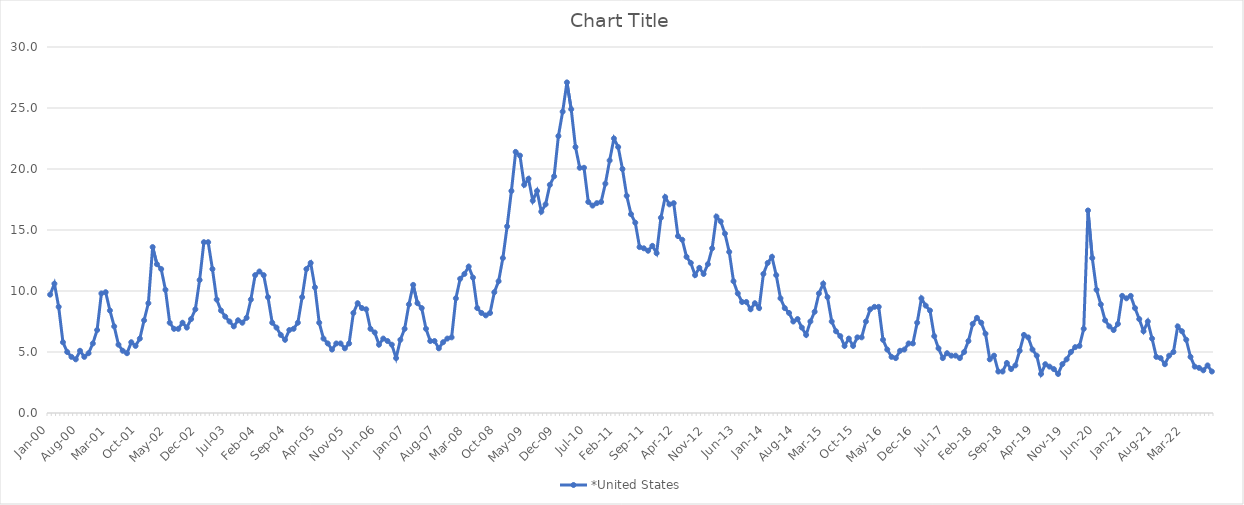
| Category | *United States | Alaska | Alabama | Arkansas | Arizona | California | Colorado | Connecticut | Delaware | Florida | Georgia | Hawaii | Iowa | Idaho | Illinois | Indiana | Kansas | Kentucky | Louisiana | Massachusetts | Maryland | Maine | Michigan | Minnesota | Missouri | Mississippi | Montana | North Carolina | North Dakota | Nebraska | New Hampshire | New Jersey | New Mexico | Nevada | New York | Ohio | Oklahoma | Oregon | Pennsylvania | Rhode Island | South Carolina | South Dakota | Tennessee | Texas | Utah | Virginia | Vermont | Washington | Wisconsin | West Virginia | Wyoming |
|---|---|---|---|---|---|---|---|---|---|---|---|---|---|---|---|---|---|---|---|---|---|---|---|---|---|---|---|---|---|---|---|---|---|---|---|---|---|---|---|---|---|---|---|---|---|---|---|---|---|---|---|
| Jan-00 | 9.7 |  |  |  |  |  |  |  |  |  |  |  |  |  |  |  |  |  |  |  |  |  |  |  |  |  |  |  |  |  |  |  |  |  |  |  |  |  |  |  |  |  |  |  |  |  |  |  |  |  |  |
| Feb-00 | 10.6 |  |  |  |  |  |  |  |  |  |  |  |  |  |  |  |  |  |  |  |  |  |  |  |  |  |  |  |  |  |  |  |  |  |  |  |  |  |  |  |  |  |  |  |  |  |  |  |  |  |  |
| Mar-00 | 8.7 |  |  |  |  |  |  |  |  |  |  |  |  |  |  |  |  |  |  |  |  |  |  |  |  |  |  |  |  |  |  |  |  |  |  |  |  |  |  |  |  |  |  |  |  |  |  |  |  |  |  |
| Apr-00 | 5.8 |  |  |  |  |  |  |  |  |  |  |  |  |  |  |  |  |  |  |  |  |  |  |  |  |  |  |  |  |  |  |  |  |  |  |  |  |  |  |  |  |  |  |  |  |  |  |  |  |  |  |
| May-00 | 5 |  |  |  |  |  |  |  |  |  |  |  |  |  |  |  |  |  |  |  |  |  |  |  |  |  |  |  |  |  |  |  |  |  |  |  |  |  |  |  |  |  |  |  |  |  |  |  |  |  |  |
| Jun-00 | 4.6 |  |  |  |  |  |  |  |  |  |  |  |  |  |  |  |  |  |  |  |  |  |  |  |  |  |  |  |  |  |  |  |  |  |  |  |  |  |  |  |  |  |  |  |  |  |  |  |  |  |  |
| Jul-00 | 4.4 |  |  |  |  |  |  |  |  |  |  |  |  |  |  |  |  |  |  |  |  |  |  |  |  |  |  |  |  |  |  |  |  |  |  |  |  |  |  |  |  |  |  |  |  |  |  |  |  |  |  |
| Aug-00 | 5.1 |  |  |  |  |  |  |  |  |  |  |  |  |  |  |  |  |  |  |  |  |  |  |  |  |  |  |  |  |  |  |  |  |  |  |  |  |  |  |  |  |  |  |  |  |  |  |  |  |  |  |
| Sep-00 | 4.6 |  |  |  |  |  |  |  |  |  |  |  |  |  |  |  |  |  |  |  |  |  |  |  |  |  |  |  |  |  |  |  |  |  |  |  |  |  |  |  |  |  |  |  |  |  |  |  |  |  |  |
| Oct-00 | 4.9 |  |  |  |  |  |  |  |  |  |  |  |  |  |  |  |  |  |  |  |  |  |  |  |  |  |  |  |  |  |  |  |  |  |  |  |  |  |  |  |  |  |  |  |  |  |  |  |  |  |  |
| Nov-00 | 5.7 |  |  |  |  |  |  |  |  |  |  |  |  |  |  |  |  |  |  |  |  |  |  |  |  |  |  |  |  |  |  |  |  |  |  |  |  |  |  |  |  |  |  |  |  |  |  |  |  |  |  |
| Dec-00 | 6.8 |  |  |  |  |  |  |  |  |  |  |  |  |  |  |  |  |  |  |  |  |  |  |  |  |  |  |  |  |  |  |  |  |  |  |  |  |  |  |  |  |  |  |  |  |  |  |  |  |  |  |
| Jan-01 | 9.8 |  |  |  |  |  |  |  |  |  |  |  |  |  |  |  |  |  |  |  |  |  |  |  |  |  |  |  |  |  |  |  |  |  |  |  |  |  |  |  |  |  |  |  |  |  |  |  |  |  |  |
| Feb-01 | 9.9 |  |  |  |  |  |  |  |  |  |  |  |  |  |  |  |  |  |  |  |  |  |  |  |  |  |  |  |  |  |  |  |  |  |  |  |  |  |  |  |  |  |  |  |  |  |  |  |  |  |  |
| Mar-01 | 8.4 |  |  |  |  |  |  |  |  |  |  |  |  |  |  |  |  |  |  |  |  |  |  |  |  |  |  |  |  |  |  |  |  |  |  |  |  |  |  |  |  |  |  |  |  |  |  |  |  |  |  |
| Apr-01 | 7.1 |  |  |  |  |  |  |  |  |  |  |  |  |  |  |  |  |  |  |  |  |  |  |  |  |  |  |  |  |  |  |  |  |  |  |  |  |  |  |  |  |  |  |  |  |  |  |  |  |  |  |
| May-01 | 5.6 |  |  |  |  |  |  |  |  |  |  |  |  |  |  |  |  |  |  |  |  |  |  |  |  |  |  |  |  |  |  |  |  |  |  |  |  |  |  |  |  |  |  |  |  |  |  |  |  |  |  |
| Jun-01 | 5.1 |  |  |  |  |  |  |  |  |  |  |  |  |  |  |  |  |  |  |  |  |  |  |  |  |  |  |  |  |  |  |  |  |  |  |  |  |  |  |  |  |  |  |  |  |  |  |  |  |  |  |
| Jul-01 | 4.9 |  |  |  |  |  |  |  |  |  |  |  |  |  |  |  |  |  |  |  |  |  |  |  |  |  |  |  |  |  |  |  |  |  |  |  |  |  |  |  |  |  |  |  |  |  |  |  |  |  |  |
| Aug-01 | 5.8 |  |  |  |  |  |  |  |  |  |  |  |  |  |  |  |  |  |  |  |  |  |  |  |  |  |  |  |  |  |  |  |  |  |  |  |  |  |  |  |  |  |  |  |  |  |  |  |  |  |  |
| Sep-01 | 5.5 |  |  |  |  |  |  |  |  |  |  |  |  |  |  |  |  |  |  |  |  |  |  |  |  |  |  |  |  |  |  |  |  |  |  |  |  |  |  |  |  |  |  |  |  |  |  |  |  |  |  |
| Oct-01 | 6.1 |  |  |  |  |  |  |  |  |  |  |  |  |  |  |  |  |  |  |  |  |  |  |  |  |  |  |  |  |  |  |  |  |  |  |  |  |  |  |  |  |  |  |  |  |  |  |  |  |  |  |
| Nov-01 | 7.6 |  |  |  |  |  |  |  |  |  |  |  |  |  |  |  |  |  |  |  |  |  |  |  |  |  |  |  |  |  |  |  |  |  |  |  |  |  |  |  |  |  |  |  |  |  |  |  |  |  |  |
| Dec-01 | 9 |  |  |  |  |  |  |  |  |  |  |  |  |  |  |  |  |  |  |  |  |  |  |  |  |  |  |  |  |  |  |  |  |  |  |  |  |  |  |  |  |  |  |  |  |  |  |  |  |  |  |
| Jan-02 | 13.6 |  |  |  |  |  |  |  |  |  |  |  |  |  |  |  |  |  |  |  |  |  |  |  |  |  |  |  |  |  |  |  |  |  |  |  |  |  |  |  |  |  |  |  |  |  |  |  |  |  |  |
| Feb-02 | 12.2 |  |  |  |  |  |  |  |  |  |  |  |  |  |  |  |  |  |  |  |  |  |  |  |  |  |  |  |  |  |  |  |  |  |  |  |  |  |  |  |  |  |  |  |  |  |  |  |  |  |  |
| Mar-02 | 11.8 |  |  |  |  |  |  |  |  |  |  |  |  |  |  |  |  |  |  |  |  |  |  |  |  |  |  |  |  |  |  |  |  |  |  |  |  |  |  |  |  |  |  |  |  |  |  |  |  |  |  |
| Apr-02 | 10.1 |  |  |  |  |  |  |  |  |  |  |  |  |  |  |  |  |  |  |  |  |  |  |  |  |  |  |  |  |  |  |  |  |  |  |  |  |  |  |  |  |  |  |  |  |  |  |  |  |  |  |
| May-02 | 7.4 |  |  |  |  |  |  |  |  |  |  |  |  |  |  |  |  |  |  |  |  |  |  |  |  |  |  |  |  |  |  |  |  |  |  |  |  |  |  |  |  |  |  |  |  |  |  |  |  |  |  |
| Jun-02 | 6.9 |  |  |  |  |  |  |  |  |  |  |  |  |  |  |  |  |  |  |  |  |  |  |  |  |  |  |  |  |  |  |  |  |  |  |  |  |  |  |  |  |  |  |  |  |  |  |  |  |  |  |
| Jul-02 | 6.9 |  |  |  |  |  |  |  |  |  |  |  |  |  |  |  |  |  |  |  |  |  |  |  |  |  |  |  |  |  |  |  |  |  |  |  |  |  |  |  |  |  |  |  |  |  |  |  |  |  |  |
| Aug-02 | 7.4 |  |  |  |  |  |  |  |  |  |  |  |  |  |  |  |  |  |  |  |  |  |  |  |  |  |  |  |  |  |  |  |  |  |  |  |  |  |  |  |  |  |  |  |  |  |  |  |  |  |  |
| Sep-02 | 7 |  |  |  |  |  |  |  |  |  |  |  |  |  |  |  |  |  |  |  |  |  |  |  |  |  |  |  |  |  |  |  |  |  |  |  |  |  |  |  |  |  |  |  |  |  |  |  |  |  |  |
| Oct-02 | 7.7 |  |  |  |  |  |  |  |  |  |  |  |  |  |  |  |  |  |  |  |  |  |  |  |  |  |  |  |  |  |  |  |  |  |  |  |  |  |  |  |  |  |  |  |  |  |  |  |  |  |  |
| Nov-02 | 8.5 |  |  |  |  |  |  |  |  |  |  |  |  |  |  |  |  |  |  |  |  |  |  |  |  |  |  |  |  |  |  |  |  |  |  |  |  |  |  |  |  |  |  |  |  |  |  |  |  |  |  |
| Dec-02 | 10.9 |  |  |  |  |  |  |  |  |  |  |  |  |  |  |  |  |  |  |  |  |  |  |  |  |  |  |  |  |  |  |  |  |  |  |  |  |  |  |  |  |  |  |  |  |  |  |  |  |  |  |
| Jan-03 | 14 |  |  |  |  |  |  |  |  |  |  |  |  |  |  |  |  |  |  |  |  |  |  |  |  |  |  |  |  |  |  |  |  |  |  |  |  |  |  |  |  |  |  |  |  |  |  |  |  |  |  |
| Feb-03 | 14 |  |  |  |  |  |  |  |  |  |  |  |  |  |  |  |  |  |  |  |  |  |  |  |  |  |  |  |  |  |  |  |  |  |  |  |  |  |  |  |  |  |  |  |  |  |  |  |  |  |  |
| Mar-03 | 11.8 |  |  |  |  |  |  |  |  |  |  |  |  |  |  |  |  |  |  |  |  |  |  |  |  |  |  |  |  |  |  |  |  |  |  |  |  |  |  |  |  |  |  |  |  |  |  |  |  |  |  |
| Apr-03 | 9.3 |  |  |  |  |  |  |  |  |  |  |  |  |  |  |  |  |  |  |  |  |  |  |  |  |  |  |  |  |  |  |  |  |  |  |  |  |  |  |  |  |  |  |  |  |  |  |  |  |  |  |
| May-03 | 8.4 |  |  |  |  |  |  |  |  |  |  |  |  |  |  |  |  |  |  |  |  |  |  |  |  |  |  |  |  |  |  |  |  |  |  |  |  |  |  |  |  |  |  |  |  |  |  |  |  |  |  |
| Jun-03 | 7.9 |  |  |  |  |  |  |  |  |  |  |  |  |  |  |  |  |  |  |  |  |  |  |  |  |  |  |  |  |  |  |  |  |  |  |  |  |  |  |  |  |  |  |  |  |  |  |  |  |  |  |
| Jul-03 | 7.5 |  |  |  |  |  |  |  |  |  |  |  |  |  |  |  |  |  |  |  |  |  |  |  |  |  |  |  |  |  |  |  |  |  |  |  |  |  |  |  |  |  |  |  |  |  |  |  |  |  |  |
| Aug-03 | 7.1 |  |  |  |  |  |  |  |  |  |  |  |  |  |  |  |  |  |  |  |  |  |  |  |  |  |  |  |  |  |  |  |  |  |  |  |  |  |  |  |  |  |  |  |  |  |  |  |  |  |  |
| Sep-03 | 7.6 |  |  |  |  |  |  |  |  |  |  |  |  |  |  |  |  |  |  |  |  |  |  |  |  |  |  |  |  |  |  |  |  |  |  |  |  |  |  |  |  |  |  |  |  |  |  |  |  |  |  |
| Oct-03 | 7.4 |  |  |  |  |  |  |  |  |  |  |  |  |  |  |  |  |  |  |  |  |  |  |  |  |  |  |  |  |  |  |  |  |  |  |  |  |  |  |  |  |  |  |  |  |  |  |  |  |  |  |
| Nov-03 | 7.8 |  |  |  |  |  |  |  |  |  |  |  |  |  |  |  |  |  |  |  |  |  |  |  |  |  |  |  |  |  |  |  |  |  |  |  |  |  |  |  |  |  |  |  |  |  |  |  |  |  |  |
| Dec-03 | 9.3 |  |  |  |  |  |  |  |  |  |  |  |  |  |  |  |  |  |  |  |  |  |  |  |  |  |  |  |  |  |  |  |  |  |  |  |  |  |  |  |  |  |  |  |  |  |  |  |  |  |  |
| Jan-04 | 11.3 |  |  |  |  |  |  |  |  |  |  |  |  |  |  |  |  |  |  |  |  |  |  |  |  |  |  |  |  |  |  |  |  |  |  |  |  |  |  |  |  |  |  |  |  |  |  |  |  |  |  |
| Feb-04 | 11.6 |  |  |  |  |  |  |  |  |  |  |  |  |  |  |  |  |  |  |  |  |  |  |  |  |  |  |  |  |  |  |  |  |  |  |  |  |  |  |  |  |  |  |  |  |  |  |  |  |  |  |
| Mar-04 | 11.3 |  |  |  |  |  |  |  |  |  |  |  |  |  |  |  |  |  |  |  |  |  |  |  |  |  |  |  |  |  |  |  |  |  |  |  |  |  |  |  |  |  |  |  |  |  |  |  |  |  |  |
| Apr-04 | 9.5 |  |  |  |  |  |  |  |  |  |  |  |  |  |  |  |  |  |  |  |  |  |  |  |  |  |  |  |  |  |  |  |  |  |  |  |  |  |  |  |  |  |  |  |  |  |  |  |  |  |  |
| May-04 | 7.4 |  |  |  |  |  |  |  |  |  |  |  |  |  |  |  |  |  |  |  |  |  |  |  |  |  |  |  |  |  |  |  |  |  |  |  |  |  |  |  |  |  |  |  |  |  |  |  |  |  |  |
| Jun-04 | 7 |  |  |  |  |  |  |  |  |  |  |  |  |  |  |  |  |  |  |  |  |  |  |  |  |  |  |  |  |  |  |  |  |  |  |  |  |  |  |  |  |  |  |  |  |  |  |  |  |  |  |
| Jul-04 | 6.4 |  |  |  |  |  |  |  |  |  |  |  |  |  |  |  |  |  |  |  |  |  |  |  |  |  |  |  |  |  |  |  |  |  |  |  |  |  |  |  |  |  |  |  |  |  |  |  |  |  |  |
| Aug-04 | 6 |  |  |  |  |  |  |  |  |  |  |  |  |  |  |  |  |  |  |  |  |  |  |  |  |  |  |  |  |  |  |  |  |  |  |  |  |  |  |  |  |  |  |  |  |  |  |  |  |  |  |
| Sep-04 | 6.8 |  |  |  |  |  |  |  |  |  |  |  |  |  |  |  |  |  |  |  |  |  |  |  |  |  |  |  |  |  |  |  |  |  |  |  |  |  |  |  |  |  |  |  |  |  |  |  |  |  |  |
| Oct-04 | 6.9 |  |  |  |  |  |  |  |  |  |  |  |  |  |  |  |  |  |  |  |  |  |  |  |  |  |  |  |  |  |  |  |  |  |  |  |  |  |  |  |  |  |  |  |  |  |  |  |  |  |  |
| Nov-04 | 7.4 |  |  |  |  |  |  |  |  |  |  |  |  |  |  |  |  |  |  |  |  |  |  |  |  |  |  |  |  |  |  |  |  |  |  |  |  |  |  |  |  |  |  |  |  |  |  |  |  |  |  |
| Dec-04 | 9.5 |  |  |  |  |  |  |  |  |  |  |  |  |  |  |  |  |  |  |  |  |  |  |  |  |  |  |  |  |  |  |  |  |  |  |  |  |  |  |  |  |  |  |  |  |  |  |  |  |  |  |
| Jan-05 | 11.8 |  |  |  |  |  |  |  |  |  |  |  |  |  |  |  |  |  |  |  |  |  |  |  |  |  |  |  |  |  |  |  |  |  |  |  |  |  |  |  |  |  |  |  |  |  |  |  |  |  |  |
| Feb-05 | 12.3 |  |  |  |  |  |  |  |  |  |  |  |  |  |  |  |  |  |  |  |  |  |  |  |  |  |  |  |  |  |  |  |  |  |  |  |  |  |  |  |  |  |  |  |  |  |  |  |  |  |  |
| Mar-05 | 10.3 |  |  |  |  |  |  |  |  |  |  |  |  |  |  |  |  |  |  |  |  |  |  |  |  |  |  |  |  |  |  |  |  |  |  |  |  |  |  |  |  |  |  |  |  |  |  |  |  |  |  |
| Apr-05 | 7.4 |  |  |  |  |  |  |  |  |  |  |  |  |  |  |  |  |  |  |  |  |  |  |  |  |  |  |  |  |  |  |  |  |  |  |  |  |  |  |  |  |  |  |  |  |  |  |  |  |  |  |
| May-05 | 6.1 |  |  |  |  |  |  |  |  |  |  |  |  |  |  |  |  |  |  |  |  |  |  |  |  |  |  |  |  |  |  |  |  |  |  |  |  |  |  |  |  |  |  |  |  |  |  |  |  |  |  |
| Jun-05 | 5.7 |  |  |  |  |  |  |  |  |  |  |  |  |  |  |  |  |  |  |  |  |  |  |  |  |  |  |  |  |  |  |  |  |  |  |  |  |  |  |  |  |  |  |  |  |  |  |  |  |  |  |
| Jul-05 | 5.2 |  |  |  |  |  |  |  |  |  |  |  |  |  |  |  |  |  |  |  |  |  |  |  |  |  |  |  |  |  |  |  |  |  |  |  |  |  |  |  |  |  |  |  |  |  |  |  |  |  |  |
| Aug-05 | 5.7 |  |  |  |  |  |  |  |  |  |  |  |  |  |  |  |  |  |  |  |  |  |  |  |  |  |  |  |  |  |  |  |  |  |  |  |  |  |  |  |  |  |  |  |  |  |  |  |  |  |  |
| Sep-05 | 5.7 |  |  |  |  |  |  |  |  |  |  |  |  |  |  |  |  |  |  |  |  |  |  |  |  |  |  |  |  |  |  |  |  |  |  |  |  |  |  |  |  |  |  |  |  |  |  |  |  |  |  |
| Oct-05 | 5.3 |  |  |  |  |  |  |  |  |  |  |  |  |  |  |  |  |  |  |  |  |  |  |  |  |  |  |  |  |  |  |  |  |  |  |  |  |  |  |  |  |  |  |  |  |  |  |  |  |  |  |
| Nov-05 | 5.7 |  |  |  |  |  |  |  |  |  |  |  |  |  |  |  |  |  |  |  |  |  |  |  |  |  |  |  |  |  |  |  |  |  |  |  |  |  |  |  |  |  |  |  |  |  |  |  |  |  |  |
| Dec-05 | 8.2 |  |  |  |  |  |  |  |  |  |  |  |  |  |  |  |  |  |  |  |  |  |  |  |  |  |  |  |  |  |  |  |  |  |  |  |  |  |  |  |  |  |  |  |  |  |  |  |  |  |  |
| Jan-06 | 9 |  |  |  |  |  |  |  |  |  |  |  |  |  |  |  |  |  |  |  |  |  |  |  |  |  |  |  |  |  |  |  |  |  |  |  |  |  |  |  |  |  |  |  |  |  |  |  |  |  |  |
| Feb-06 | 8.6 |  |  |  |  |  |  |  |  |  |  |  |  |  |  |  |  |  |  |  |  |  |  |  |  |  |  |  |  |  |  |  |  |  |  |  |  |  |  |  |  |  |  |  |  |  |  |  |  |  |  |
| Mar-06 | 8.5 |  |  |  |  |  |  |  |  |  |  |  |  |  |  |  |  |  |  |  |  |  |  |  |  |  |  |  |  |  |  |  |  |  |  |  |  |  |  |  |  |  |  |  |  |  |  |  |  |  |  |
| Apr-06 | 6.9 |  |  |  |  |  |  |  |  |  |  |  |  |  |  |  |  |  |  |  |  |  |  |  |  |  |  |  |  |  |  |  |  |  |  |  |  |  |  |  |  |  |  |  |  |  |  |  |  |  |  |
| May-06 | 6.6 |  |  |  |  |  |  |  |  |  |  |  |  |  |  |  |  |  |  |  |  |  |  |  |  |  |  |  |  |  |  |  |  |  |  |  |  |  |  |  |  |  |  |  |  |  |  |  |  |  |  |
| Jun-06 | 5.6 |  |  |  |  |  |  |  |  |  |  |  |  |  |  |  |  |  |  |  |  |  |  |  |  |  |  |  |  |  |  |  |  |  |  |  |  |  |  |  |  |  |  |  |  |  |  |  |  |  |  |
| Jul-06 | 6.1 |  |  |  |  |  |  |  |  |  |  |  |  |  |  |  |  |  |  |  |  |  |  |  |  |  |  |  |  |  |  |  |  |  |  |  |  |  |  |  |  |  |  |  |  |  |  |  |  |  |  |
| Aug-06 | 5.9 |  |  |  |  |  |  |  |  |  |  |  |  |  |  |  |  |  |  |  |  |  |  |  |  |  |  |  |  |  |  |  |  |  |  |  |  |  |  |  |  |  |  |  |  |  |  |  |  |  |  |
| Sep-06 | 5.6 |  |  |  |  |  |  |  |  |  |  |  |  |  |  |  |  |  |  |  |  |  |  |  |  |  |  |  |  |  |  |  |  |  |  |  |  |  |  |  |  |  |  |  |  |  |  |  |  |  |  |
| Oct-06 | 4.5 |  |  |  |  |  |  |  |  |  |  |  |  |  |  |  |  |  |  |  |  |  |  |  |  |  |  |  |  |  |  |  |  |  |  |  |  |  |  |  |  |  |  |  |  |  |  |  |  |  |  |
| Nov-06 | 6 |  |  |  |  |  |  |  |  |  |  |  |  |  |  |  |  |  |  |  |  |  |  |  |  |  |  |  |  |  |  |  |  |  |  |  |  |  |  |  |  |  |  |  |  |  |  |  |  |  |  |
| Dec-06 | 6.9 |  |  |  |  |  |  |  |  |  |  |  |  |  |  |  |  |  |  |  |  |  |  |  |  |  |  |  |  |  |  |  |  |  |  |  |  |  |  |  |  |  |  |  |  |  |  |  |  |  |  |
| Jan-07 | 8.9 |  |  |  |  |  |  |  |  |  |  |  |  |  |  |  |  |  |  |  |  |  |  |  |  |  |  |  |  |  |  |  |  |  |  |  |  |  |  |  |  |  |  |  |  |  |  |  |  |  |  |
| Feb-07 | 10.5 |  |  |  |  |  |  |  |  |  |  |  |  |  |  |  |  |  |  |  |  |  |  |  |  |  |  |  |  |  |  |  |  |  |  |  |  |  |  |  |  |  |  |  |  |  |  |  |  |  |  |
| Mar-07 | 9 |  |  |  |  |  |  |  |  |  |  |  |  |  |  |  |  |  |  |  |  |  |  |  |  |  |  |  |  |  |  |  |  |  |  |  |  |  |  |  |  |  |  |  |  |  |  |  |  |  |  |
| Apr-07 | 8.6 |  |  |  |  |  |  |  |  |  |  |  |  |  |  |  |  |  |  |  |  |  |  |  |  |  |  |  |  |  |  |  |  |  |  |  |  |  |  |  |  |  |  |  |  |  |  |  |  |  |  |
| May-07 | 6.9 |  |  |  |  |  |  |  |  |  |  |  |  |  |  |  |  |  |  |  |  |  |  |  |  |  |  |  |  |  |  |  |  |  |  |  |  |  |  |  |  |  |  |  |  |  |  |  |  |  |  |
| Jun-07 | 5.9 |  |  |  |  |  |  |  |  |  |  |  |  |  |  |  |  |  |  |  |  |  |  |  |  |  |  |  |  |  |  |  |  |  |  |  |  |  |  |  |  |  |  |  |  |  |  |  |  |  |  |
| Jul-07 | 5.9 |  |  |  |  |  |  |  |  |  |  |  |  |  |  |  |  |  |  |  |  |  |  |  |  |  |  |  |  |  |  |  |  |  |  |  |  |  |  |  |  |  |  |  |  |  |  |  |  |  |  |
| Aug-07 | 5.3 |  |  |  |  |  |  |  |  |  |  |  |  |  |  |  |  |  |  |  |  |  |  |  |  |  |  |  |  |  |  |  |  |  |  |  |  |  |  |  |  |  |  |  |  |  |  |  |  |  |  |
| Sep-07 | 5.8 |  |  |  |  |  |  |  |  |  |  |  |  |  |  |  |  |  |  |  |  |  |  |  |  |  |  |  |  |  |  |  |  |  |  |  |  |  |  |  |  |  |  |  |  |  |  |  |  |  |  |
| Oct-07 | 6.1 |  |  |  |  |  |  |  |  |  |  |  |  |  |  |  |  |  |  |  |  |  |  |  |  |  |  |  |  |  |  |  |  |  |  |  |  |  |  |  |  |  |  |  |  |  |  |  |  |  |  |
| Nov-07 | 6.2 |  |  |  |  |  |  |  |  |  |  |  |  |  |  |  |  |  |  |  |  |  |  |  |  |  |  |  |  |  |  |  |  |  |  |  |  |  |  |  |  |  |  |  |  |  |  |  |  |  |  |
| Dec-07 | 9.4 |  |  |  |  |  |  |  |  |  |  |  |  |  |  |  |  |  |  |  |  |  |  |  |  |  |  |  |  |  |  |  |  |  |  |  |  |  |  |  |  |  |  |  |  |  |  |  |  |  |  |
| Jan-08 | 11 |  |  |  |  |  |  |  |  |  |  |  |  |  |  |  |  |  |  |  |  |  |  |  |  |  |  |  |  |  |  |  |  |  |  |  |  |  |  |  |  |  |  |  |  |  |  |  |  |  |  |
| Feb-08 | 11.4 |  |  |  |  |  |  |  |  |  |  |  |  |  |  |  |  |  |  |  |  |  |  |  |  |  |  |  |  |  |  |  |  |  |  |  |  |  |  |  |  |  |  |  |  |  |  |  |  |  |  |
| Mar-08 | 12 |  |  |  |  |  |  |  |  |  |  |  |  |  |  |  |  |  |  |  |  |  |  |  |  |  |  |  |  |  |  |  |  |  |  |  |  |  |  |  |  |  |  |  |  |  |  |  |  |  |  |
| Apr-08 | 11.1 |  |  |  |  |  |  |  |  |  |  |  |  |  |  |  |  |  |  |  |  |  |  |  |  |  |  |  |  |  |  |  |  |  |  |  |  |  |  |  |  |  |  |  |  |  |  |  |  |  |  |
| May-08 | 8.6 |  |  |  |  |  |  |  |  |  |  |  |  |  |  |  |  |  |  |  |  |  |  |  |  |  |  |  |  |  |  |  |  |  |  |  |  |  |  |  |  |  |  |  |  |  |  |  |  |  |  |
| Jun-08 | 8.2 |  |  |  |  |  |  |  |  |  |  |  |  |  |  |  |  |  |  |  |  |  |  |  |  |  |  |  |  |  |  |  |  |  |  |  |  |  |  |  |  |  |  |  |  |  |  |  |  |  |  |
| Jul-08 | 8 |  |  |  |  |  |  |  |  |  |  |  |  |  |  |  |  |  |  |  |  |  |  |  |  |  |  |  |  |  |  |  |  |  |  |  |  |  |  |  |  |  |  |  |  |  |  |  |  |  |  |
| Aug-08 | 8.2 |  |  |  |  |  |  |  |  |  |  |  |  |  |  |  |  |  |  |  |  |  |  |  |  |  |  |  |  |  |  |  |  |  |  |  |  |  |  |  |  |  |  |  |  |  |  |  |  |  |  |
| Sep-08 | 9.9 |  |  |  |  |  |  |  |  |  |  |  |  |  |  |  |  |  |  |  |  |  |  |  |  |  |  |  |  |  |  |  |  |  |  |  |  |  |  |  |  |  |  |  |  |  |  |  |  |  |  |
| Oct-08 | 10.8 |  |  |  |  |  |  |  |  |  |  |  |  |  |  |  |  |  |  |  |  |  |  |  |  |  |  |  |  |  |  |  |  |  |  |  |  |  |  |  |  |  |  |  |  |  |  |  |  |  |  |
| Nov-08 | 12.7 |  |  |  |  |  |  |  |  |  |  |  |  |  |  |  |  |  |  |  |  |  |  |  |  |  |  |  |  |  |  |  |  |  |  |  |  |  |  |  |  |  |  |  |  |  |  |  |  |  |  |
| Dec-08 | 15.3 |  |  |  |  |  |  |  |  |  |  |  |  |  |  |  |  |  |  |  |  |  |  |  |  |  |  |  |  |  |  |  |  |  |  |  |  |  |  |  |  |  |  |  |  |  |  |  |  |  |  |
| Jan-09 | 18.2 |  |  |  |  |  |  |  |  |  |  |  |  |  |  |  |  |  |  |  |  |  |  |  |  |  |  |  |  |  |  |  |  |  |  |  |  |  |  |  |  |  |  |  |  |  |  |  |  |  |  |
| Feb-09 | 21.4 |  |  |  |  |  |  |  |  |  |  |  |  |  |  |  |  |  |  |  |  |  |  |  |  |  |  |  |  |  |  |  |  |  |  |  |  |  |  |  |  |  |  |  |  |  |  |  |  |  |  |
| Mar-09 | 21.1 |  |  |  |  |  |  |  |  |  |  |  |  |  |  |  |  |  |  |  |  |  |  |  |  |  |  |  |  |  |  |  |  |  |  |  |  |  |  |  |  |  |  |  |  |  |  |  |  |  |  |
| Apr-09 | 18.7 |  |  |  |  |  |  |  |  |  |  |  |  |  |  |  |  |  |  |  |  |  |  |  |  |  |  |  |  |  |  |  |  |  |  |  |  |  |  |  |  |  |  |  |  |  |  |  |  |  |  |
| May-09 | 19.2 |  |  |  |  |  |  |  |  |  |  |  |  |  |  |  |  |  |  |  |  |  |  |  |  |  |  |  |  |  |  |  |  |  |  |  |  |  |  |  |  |  |  |  |  |  |  |  |  |  |  |
| Jun-09 | 17.4 |  |  |  |  |  |  |  |  |  |  |  |  |  |  |  |  |  |  |  |  |  |  |  |  |  |  |  |  |  |  |  |  |  |  |  |  |  |  |  |  |  |  |  |  |  |  |  |  |  |  |
| Jul-09 | 18.2 |  |  |  |  |  |  |  |  |  |  |  |  |  |  |  |  |  |  |  |  |  |  |  |  |  |  |  |  |  |  |  |  |  |  |  |  |  |  |  |  |  |  |  |  |  |  |  |  |  |  |
| Aug-09 | 16.5 |  |  |  |  |  |  |  |  |  |  |  |  |  |  |  |  |  |  |  |  |  |  |  |  |  |  |  |  |  |  |  |  |  |  |  |  |  |  |  |  |  |  |  |  |  |  |  |  |  |  |
| Sep-09 | 17.1 |  |  |  |  |  |  |  |  |  |  |  |  |  |  |  |  |  |  |  |  |  |  |  |  |  |  |  |  |  |  |  |  |  |  |  |  |  |  |  |  |  |  |  |  |  |  |  |  |  |  |
| Oct-09 | 18.7 |  |  |  |  |  |  |  |  |  |  |  |  |  |  |  |  |  |  |  |  |  |  |  |  |  |  |  |  |  |  |  |  |  |  |  |  |  |  |  |  |  |  |  |  |  |  |  |  |  |  |
| Nov-09 | 19.4 |  |  |  |  |  |  |  |  |  |  |  |  |  |  |  |  |  |  |  |  |  |  |  |  |  |  |  |  |  |  |  |  |  |  |  |  |  |  |  |  |  |  |  |  |  |  |  |  |  |  |
| Dec-09 | 22.7 |  |  |  |  |  |  |  |  |  |  |  |  |  |  |  |  |  |  |  |  |  |  |  |  |  |  |  |  |  |  |  |  |  |  |  |  |  |  |  |  |  |  |  |  |  |  |  |  |  |  |
| Jan-10 | 24.7 |  |  |  |  |  |  |  |  |  |  |  |  |  |  |  |  |  |  |  |  |  |  |  |  |  |  |  |  |  |  |  |  |  |  |  |  |  |  |  |  |  |  |  |  |  |  |  |  |  |  |
| Feb-10 | 27.1 |  |  |  |  |  |  |  |  |  |  |  |  |  |  |  |  |  |  |  |  |  |  |  |  |  |  |  |  |  |  |  |  |  |  |  |  |  |  |  |  |  |  |  |  |  |  |  |  |  |  |
| Mar-10 | 24.9 |  |  |  |  |  |  |  |  |  |  |  |  |  |  |  |  |  |  |  |  |  |  |  |  |  |  |  |  |  |  |  |  |  |  |  |  |  |  |  |  |  |  |  |  |  |  |  |  |  |  |
| Apr-10 | 21.8 |  |  |  |  |  |  |  |  |  |  |  |  |  |  |  |  |  |  |  |  |  |  |  |  |  |  |  |  |  |  |  |  |  |  |  |  |  |  |  |  |  |  |  |  |  |  |  |  |  |  |
| May-10 | 20.1 |  |  |  |  |  |  |  |  |  |  |  |  |  |  |  |  |  |  |  |  |  |  |  |  |  |  |  |  |  |  |  |  |  |  |  |  |  |  |  |  |  |  |  |  |  |  |  |  |  |  |
| Jun-10 | 20.1 |  |  |  |  |  |  |  |  |  |  |  |  |  |  |  |  |  |  |  |  |  |  |  |  |  |  |  |  |  |  |  |  |  |  |  |  |  |  |  |  |  |  |  |  |  |  |  |  |  |  |
| Jul-10 | 17.3 |  |  |  |  |  |  |  |  |  |  |  |  |  |  |  |  |  |  |  |  |  |  |  |  |  |  |  |  |  |  |  |  |  |  |  |  |  |  |  |  |  |  |  |  |  |  |  |  |  |  |
| Aug-10 | 17 |  |  |  |  |  |  |  |  |  |  |  |  |  |  |  |  |  |  |  |  |  |  |  |  |  |  |  |  |  |  |  |  |  |  |  |  |  |  |  |  |  |  |  |  |  |  |  |  |  |  |
| Sep-10 | 17.2 |  |  |  |  |  |  |  |  |  |  |  |  |  |  |  |  |  |  |  |  |  |  |  |  |  |  |  |  |  |  |  |  |  |  |  |  |  |  |  |  |  |  |  |  |  |  |  |  |  |  |
| Oct-10 | 17.3 |  |  |  |  |  |  |  |  |  |  |  |  |  |  |  |  |  |  |  |  |  |  |  |  |  |  |  |  |  |  |  |  |  |  |  |  |  |  |  |  |  |  |  |  |  |  |  |  |  |  |
| Nov-10 | 18.8 |  |  |  |  |  |  |  |  |  |  |  |  |  |  |  |  |  |  |  |  |  |  |  |  |  |  |  |  |  |  |  |  |  |  |  |  |  |  |  |  |  |  |  |  |  |  |  |  |  |  |
| Dec-10 | 20.7 |  |  |  |  |  |  |  |  |  |  |  |  |  |  |  |  |  |  |  |  |  |  |  |  |  |  |  |  |  |  |  |  |  |  |  |  |  |  |  |  |  |  |  |  |  |  |  |  |  |  |
| Jan-11 | 22.5 |  |  |  |  |  |  |  |  |  |  |  |  |  |  |  |  |  |  |  |  |  |  |  |  |  |  |  |  |  |  |  |  |  |  |  |  |  |  |  |  |  |  |  |  |  |  |  |  |  |  |
| Feb-11 | 21.8 |  |  |  |  |  |  |  |  |  |  |  |  |  |  |  |  |  |  |  |  |  |  |  |  |  |  |  |  |  |  |  |  |  |  |  |  |  |  |  |  |  |  |  |  |  |  |  |  |  |  |
| Mar-11 | 20 |  |  |  |  |  |  |  |  |  |  |  |  |  |  |  |  |  |  |  |  |  |  |  |  |  |  |  |  |  |  |  |  |  |  |  |  |  |  |  |  |  |  |  |  |  |  |  |  |  |  |
| Apr-11 | 17.8 |  |  |  |  |  |  |  |  |  |  |  |  |  |  |  |  |  |  |  |  |  |  |  |  |  |  |  |  |  |  |  |  |  |  |  |  |  |  |  |  |  |  |  |  |  |  |  |  |  |  |
| May-11 | 16.3 |  |  |  |  |  |  |  |  |  |  |  |  |  |  |  |  |  |  |  |  |  |  |  |  |  |  |  |  |  |  |  |  |  |  |  |  |  |  |  |  |  |  |  |  |  |  |  |  |  |  |
| Jun-11 | 15.6 |  |  |  |  |  |  |  |  |  |  |  |  |  |  |  |  |  |  |  |  |  |  |  |  |  |  |  |  |  |  |  |  |  |  |  |  |  |  |  |  |  |  |  |  |  |  |  |  |  |  |
| Jul-11 | 13.6 |  |  |  |  |  |  |  |  |  |  |  |  |  |  |  |  |  |  |  |  |  |  |  |  |  |  |  |  |  |  |  |  |  |  |  |  |  |  |  |  |  |  |  |  |  |  |  |  |  |  |
| Aug-11 | 13.5 |  |  |  |  |  |  |  |  |  |  |  |  |  |  |  |  |  |  |  |  |  |  |  |  |  |  |  |  |  |  |  |  |  |  |  |  |  |  |  |  |  |  |  |  |  |  |  |  |  |  |
| Sep-11 | 13.3 |  |  |  |  |  |  |  |  |  |  |  |  |  |  |  |  |  |  |  |  |  |  |  |  |  |  |  |  |  |  |  |  |  |  |  |  |  |  |  |  |  |  |  |  |  |  |  |  |  |  |
| Oct-11 | 13.7 |  |  |  |  |  |  |  |  |  |  |  |  |  |  |  |  |  |  |  |  |  |  |  |  |  |  |  |  |  |  |  |  |  |  |  |  |  |  |  |  |  |  |  |  |  |  |  |  |  |  |
| Nov-11 | 13.1 |  |  |  |  |  |  |  |  |  |  |  |  |  |  |  |  |  |  |  |  |  |  |  |  |  |  |  |  |  |  |  |  |  |  |  |  |  |  |  |  |  |  |  |  |  |  |  |  |  |  |
| Dec-11 | 16 |  |  |  |  |  |  |  |  |  |  |  |  |  |  |  |  |  |  |  |  |  |  |  |  |  |  |  |  |  |  |  |  |  |  |  |  |  |  |  |  |  |  |  |  |  |  |  |  |  |  |
| Jan-12 | 17.7 |  |  |  |  |  |  |  |  |  |  |  |  |  |  |  |  |  |  |  |  |  |  |  |  |  |  |  |  |  |  |  |  |  |  |  |  |  |  |  |  |  |  |  |  |  |  |  |  |  |  |
| Feb-12 | 17.1 |  |  |  |  |  |  |  |  |  |  |  |  |  |  |  |  |  |  |  |  |  |  |  |  |  |  |  |  |  |  |  |  |  |  |  |  |  |  |  |  |  |  |  |  |  |  |  |  |  |  |
| Mar-12 | 17.2 |  |  |  |  |  |  |  |  |  |  |  |  |  |  |  |  |  |  |  |  |  |  |  |  |  |  |  |  |  |  |  |  |  |  |  |  |  |  |  |  |  |  |  |  |  |  |  |  |  |  |
| Apr-12 | 14.5 |  |  |  |  |  |  |  |  |  |  |  |  |  |  |  |  |  |  |  |  |  |  |  |  |  |  |  |  |  |  |  |  |  |  |  |  |  |  |  |  |  |  |  |  |  |  |  |  |  |  |
| May-12 | 14.2 |  |  |  |  |  |  |  |  |  |  |  |  |  |  |  |  |  |  |  |  |  |  |  |  |  |  |  |  |  |  |  |  |  |  |  |  |  |  |  |  |  |  |  |  |  |  |  |  |  |  |
| Jun-12 | 12.8 |  |  |  |  |  |  |  |  |  |  |  |  |  |  |  |  |  |  |  |  |  |  |  |  |  |  |  |  |  |  |  |  |  |  |  |  |  |  |  |  |  |  |  |  |  |  |  |  |  |  |
| Jul-12 | 12.3 |  |  |  |  |  |  |  |  |  |  |  |  |  |  |  |  |  |  |  |  |  |  |  |  |  |  |  |  |  |  |  |  |  |  |  |  |  |  |  |  |  |  |  |  |  |  |  |  |  |  |
| Aug-12 | 11.3 |  |  |  |  |  |  |  |  |  |  |  |  |  |  |  |  |  |  |  |  |  |  |  |  |  |  |  |  |  |  |  |  |  |  |  |  |  |  |  |  |  |  |  |  |  |  |  |  |  |  |
| Sep-12 | 11.9 |  |  |  |  |  |  |  |  |  |  |  |  |  |  |  |  |  |  |  |  |  |  |  |  |  |  |  |  |  |  |  |  |  |  |  |  |  |  |  |  |  |  |  |  |  |  |  |  |  |  |
| Oct-12 | 11.4 |  |  |  |  |  |  |  |  |  |  |  |  |  |  |  |  |  |  |  |  |  |  |  |  |  |  |  |  |  |  |  |  |  |  |  |  |  |  |  |  |  |  |  |  |  |  |  |  |  |  |
| Nov-12 | 12.2 |  |  |  |  |  |  |  |  |  |  |  |  |  |  |  |  |  |  |  |  |  |  |  |  |  |  |  |  |  |  |  |  |  |  |  |  |  |  |  |  |  |  |  |  |  |  |  |  |  |  |
| Dec-12 | 13.5 |  |  |  |  |  |  |  |  |  |  |  |  |  |  |  |  |  |  |  |  |  |  |  |  |  |  |  |  |  |  |  |  |  |  |  |  |  |  |  |  |  |  |  |  |  |  |  |  |  |  |
| Jan-13 | 16.1 |  |  |  |  |  |  |  |  |  |  |  |  |  |  |  |  |  |  |  |  |  |  |  |  |  |  |  |  |  |  |  |  |  |  |  |  |  |  |  |  |  |  |  |  |  |  |  |  |  |  |
| Feb-13 | 15.7 |  |  |  |  |  |  |  |  |  |  |  |  |  |  |  |  |  |  |  |  |  |  |  |  |  |  |  |  |  |  |  |  |  |  |  |  |  |  |  |  |  |  |  |  |  |  |  |  |  |  |
| Mar-13 | 14.7 |  |  |  |  |  |  |  |  |  |  |  |  |  |  |  |  |  |  |  |  |  |  |  |  |  |  |  |  |  |  |  |  |  |  |  |  |  |  |  |  |  |  |  |  |  |  |  |  |  |  |
| Apr-13 | 13.2 |  |  |  |  |  |  |  |  |  |  |  |  |  |  |  |  |  |  |  |  |  |  |  |  |  |  |  |  |  |  |  |  |  |  |  |  |  |  |  |  |  |  |  |  |  |  |  |  |  |  |
| May-13 | 10.8 |  |  |  |  |  |  |  |  |  |  |  |  |  |  |  |  |  |  |  |  |  |  |  |  |  |  |  |  |  |  |  |  |  |  |  |  |  |  |  |  |  |  |  |  |  |  |  |  |  |  |
| Jun-13 | 9.8 |  |  |  |  |  |  |  |  |  |  |  |  |  |  |  |  |  |  |  |  |  |  |  |  |  |  |  |  |  |  |  |  |  |  |  |  |  |  |  |  |  |  |  |  |  |  |  |  |  |  |
| Jul-13 | 9.1 |  |  |  |  |  |  |  |  |  |  |  |  |  |  |  |  |  |  |  |  |  |  |  |  |  |  |  |  |  |  |  |  |  |  |  |  |  |  |  |  |  |  |  |  |  |  |  |  |  |  |
| Aug-13 | 9.1 |  |  |  |  |  |  |  |  |  |  |  |  |  |  |  |  |  |  |  |  |  |  |  |  |  |  |  |  |  |  |  |  |  |  |  |  |  |  |  |  |  |  |  |  |  |  |  |  |  |  |
| Sep-13 | 8.5 |  |  |  |  |  |  |  |  |  |  |  |  |  |  |  |  |  |  |  |  |  |  |  |  |  |  |  |  |  |  |  |  |  |  |  |  |  |  |  |  |  |  |  |  |  |  |  |  |  |  |
| Oct-13 | 9 |  |  |  |  |  |  |  |  |  |  |  |  |  |  |  |  |  |  |  |  |  |  |  |  |  |  |  |  |  |  |  |  |  |  |  |  |  |  |  |  |  |  |  |  |  |  |  |  |  |  |
| Nov-13 | 8.6 |  |  |  |  |  |  |  |  |  |  |  |  |  |  |  |  |  |  |  |  |  |  |  |  |  |  |  |  |  |  |  |  |  |  |  |  |  |  |  |  |  |  |  |  |  |  |  |  |  |  |
| Dec-13 | 11.4 |  |  |  |  |  |  |  |  |  |  |  |  |  |  |  |  |  |  |  |  |  |  |  |  |  |  |  |  |  |  |  |  |  |  |  |  |  |  |  |  |  |  |  |  |  |  |  |  |  |  |
| Jan-14 | 12.3 |  |  |  |  |  |  |  |  |  |  |  |  |  |  |  |  |  |  |  |  |  |  |  |  |  |  |  |  |  |  |  |  |  |  |  |  |  |  |  |  |  |  |  |  |  |  |  |  |  |  |
| Feb-14 | 12.8 |  |  |  |  |  |  |  |  |  |  |  |  |  |  |  |  |  |  |  |  |  |  |  |  |  |  |  |  |  |  |  |  |  |  |  |  |  |  |  |  |  |  |  |  |  |  |  |  |  |  |
| Mar-14 | 11.3 |  |  |  |  |  |  |  |  |  |  |  |  |  |  |  |  |  |  |  |  |  |  |  |  |  |  |  |  |  |  |  |  |  |  |  |  |  |  |  |  |  |  |  |  |  |  |  |  |  |  |
| Apr-14 | 9.4 |  |  |  |  |  |  |  |  |  |  |  |  |  |  |  |  |  |  |  |  |  |  |  |  |  |  |  |  |  |  |  |  |  |  |  |  |  |  |  |  |  |  |  |  |  |  |  |  |  |  |
| May-14 | 8.6 |  |  |  |  |  |  |  |  |  |  |  |  |  |  |  |  |  |  |  |  |  |  |  |  |  |  |  |  |  |  |  |  |  |  |  |  |  |  |  |  |  |  |  |  |  |  |  |  |  |  |
| Jun-14 | 8.2 |  |  |  |  |  |  |  |  |  |  |  |  |  |  |  |  |  |  |  |  |  |  |  |  |  |  |  |  |  |  |  |  |  |  |  |  |  |  |  |  |  |  |  |  |  |  |  |  |  |  |
| Jul-14 | 7.5 |  |  |  |  |  |  |  |  |  |  |  |  |  |  |  |  |  |  |  |  |  |  |  |  |  |  |  |  |  |  |  |  |  |  |  |  |  |  |  |  |  |  |  |  |  |  |  |  |  |  |
| Aug-14 | 7.7 |  |  |  |  |  |  |  |  |  |  |  |  |  |  |  |  |  |  |  |  |  |  |  |  |  |  |  |  |  |  |  |  |  |  |  |  |  |  |  |  |  |  |  |  |  |  |  |  |  |  |
| Sep-14 | 7 |  |  |  |  |  |  |  |  |  |  |  |  |  |  |  |  |  |  |  |  |  |  |  |  |  |  |  |  |  |  |  |  |  |  |  |  |  |  |  |  |  |  |  |  |  |  |  |  |  |  |
| Oct-14 | 6.4 |  |  |  |  |  |  |  |  |  |  |  |  |  |  |  |  |  |  |  |  |  |  |  |  |  |  |  |  |  |  |  |  |  |  |  |  |  |  |  |  |  |  |  |  |  |  |  |  |  |  |
| Nov-14 | 7.5 |  |  |  |  |  |  |  |  |  |  |  |  |  |  |  |  |  |  |  |  |  |  |  |  |  |  |  |  |  |  |  |  |  |  |  |  |  |  |  |  |  |  |  |  |  |  |  |  |  |  |
| Dec-14 | 8.3 |  |  |  |  |  |  |  |  |  |  |  |  |  |  |  |  |  |  |  |  |  |  |  |  |  |  |  |  |  |  |  |  |  |  |  |  |  |  |  |  |  |  |  |  |  |  |  |  |  |  |
| Jan-15 | 9.8 |  |  |  |  |  |  |  |  |  |  |  |  |  |  |  |  |  |  |  |  |  |  |  |  |  |  |  |  |  |  |  |  |  |  |  |  |  |  |  |  |  |  |  |  |  |  |  |  |  |  |
| Feb-15 | 10.6 |  |  |  |  |  |  |  |  |  |  |  |  |  |  |  |  |  |  |  |  |  |  |  |  |  |  |  |  |  |  |  |  |  |  |  |  |  |  |  |  |  |  |  |  |  |  |  |  |  |  |
| Mar-15 | 9.5 |  |  |  |  |  |  |  |  |  |  |  |  |  |  |  |  |  |  |  |  |  |  |  |  |  |  |  |  |  |  |  |  |  |  |  |  |  |  |  |  |  |  |  |  |  |  |  |  |  |  |
| Apr-15 | 7.5 |  |  |  |  |  |  |  |  |  |  |  |  |  |  |  |  |  |  |  |  |  |  |  |  |  |  |  |  |  |  |  |  |  |  |  |  |  |  |  |  |  |  |  |  |  |  |  |  |  |  |
| May-15 | 6.7 |  |  |  |  |  |  |  |  |  |  |  |  |  |  |  |  |  |  |  |  |  |  |  |  |  |  |  |  |  |  |  |  |  |  |  |  |  |  |  |  |  |  |  |  |  |  |  |  |  |  |
| Jun-15 | 6.3 |  |  |  |  |  |  |  |  |  |  |  |  |  |  |  |  |  |  |  |  |  |  |  |  |  |  |  |  |  |  |  |  |  |  |  |  |  |  |  |  |  |  |  |  |  |  |  |  |  |  |
| Jul-15 | 5.5 |  |  |  |  |  |  |  |  |  |  |  |  |  |  |  |  |  |  |  |  |  |  |  |  |  |  |  |  |  |  |  |  |  |  |  |  |  |  |  |  |  |  |  |  |  |  |  |  |  |  |
| Aug-15 | 6.1 |  |  |  |  |  |  |  |  |  |  |  |  |  |  |  |  |  |  |  |  |  |  |  |  |  |  |  |  |  |  |  |  |  |  |  |  |  |  |  |  |  |  |  |  |  |  |  |  |  |  |
| Sep-15 | 5.5 |  |  |  |  |  |  |  |  |  |  |  |  |  |  |  |  |  |  |  |  |  |  |  |  |  |  |  |  |  |  |  |  |  |  |  |  |  |  |  |  |  |  |  |  |  |  |  |  |  |  |
| Oct-15 | 6.2 |  |  |  |  |  |  |  |  |  |  |  |  |  |  |  |  |  |  |  |  |  |  |  |  |  |  |  |  |  |  |  |  |  |  |  |  |  |  |  |  |  |  |  |  |  |  |  |  |  |  |
| Nov-15 | 6.2 |  |  |  |  |  |  |  |  |  |  |  |  |  |  |  |  |  |  |  |  |  |  |  |  |  |  |  |  |  |  |  |  |  |  |  |  |  |  |  |  |  |  |  |  |  |  |  |  |  |  |
| Dec-15 | 7.5 |  |  |  |  |  |  |  |  |  |  |  |  |  |  |  |  |  |  |  |  |  |  |  |  |  |  |  |  |  |  |  |  |  |  |  |  |  |  |  |  |  |  |  |  |  |  |  |  |  |  |
| Jan-16 | 8.5 |  |  |  |  |  |  |  |  |  |  |  |  |  |  |  |  |  |  |  |  |  |  |  |  |  |  |  |  |  |  |  |  |  |  |  |  |  |  |  |  |  |  |  |  |  |  |  |  |  |  |
| Feb-16 | 8.7 |  |  |  |  |  |  |  |  |  |  |  |  |  |  |  |  |  |  |  |  |  |  |  |  |  |  |  |  |  |  |  |  |  |  |  |  |  |  |  |  |  |  |  |  |  |  |  |  |  |  |
| Mar-16 | 8.7 |  |  |  |  |  |  |  |  |  |  |  |  |  |  |  |  |  |  |  |  |  |  |  |  |  |  |  |  |  |  |  |  |  |  |  |  |  |  |  |  |  |  |  |  |  |  |  |  |  |  |
| Apr-16 | 6 |  |  |  |  |  |  |  |  |  |  |  |  |  |  |  |  |  |  |  |  |  |  |  |  |  |  |  |  |  |  |  |  |  |  |  |  |  |  |  |  |  |  |  |  |  |  |  |  |  |  |
| May-16 | 5.2 |  |  |  |  |  |  |  |  |  |  |  |  |  |  |  |  |  |  |  |  |  |  |  |  |  |  |  |  |  |  |  |  |  |  |  |  |  |  |  |  |  |  |  |  |  |  |  |  |  |  |
| Jun-16 | 4.6 |  |  |  |  |  |  |  |  |  |  |  |  |  |  |  |  |  |  |  |  |  |  |  |  |  |  |  |  |  |  |  |  |  |  |  |  |  |  |  |  |  |  |  |  |  |  |  |  |  |  |
| Jul-16 | 4.5 |  |  |  |  |  |  |  |  |  |  |  |  |  |  |  |  |  |  |  |  |  |  |  |  |  |  |  |  |  |  |  |  |  |  |  |  |  |  |  |  |  |  |  |  |  |  |  |  |  |  |
| Aug-16 | 5.1 |  |  |  |  |  |  |  |  |  |  |  |  |  |  |  |  |  |  |  |  |  |  |  |  |  |  |  |  |  |  |  |  |  |  |  |  |  |  |  |  |  |  |  |  |  |  |  |  |  |  |
| Sep-16 | 5.2 |  |  |  |  |  |  |  |  |  |  |  |  |  |  |  |  |  |  |  |  |  |  |  |  |  |  |  |  |  |  |  |  |  |  |  |  |  |  |  |  |  |  |  |  |  |  |  |  |  |  |
| Oct-16 | 5.7 |  |  |  |  |  |  |  |  |  |  |  |  |  |  |  |  |  |  |  |  |  |  |  |  |  |  |  |  |  |  |  |  |  |  |  |  |  |  |  |  |  |  |  |  |  |  |  |  |  |  |
| Nov-16 | 5.7 |  |  |  |  |  |  |  |  |  |  |  |  |  |  |  |  |  |  |  |  |  |  |  |  |  |  |  |  |  |  |  |  |  |  |  |  |  |  |  |  |  |  |  |  |  |  |  |  |  |  |
| Dec-16 | 7.4 |  |  |  |  |  |  |  |  |  |  |  |  |  |  |  |  |  |  |  |  |  |  |  |  |  |  |  |  |  |  |  |  |  |  |  |  |  |  |  |  |  |  |  |  |  |  |  |  |  |  |
| Jan-17 | 9.4 |  |  |  |  |  |  |  |  |  |  |  |  |  |  |  |  |  |  |  |  |  |  |  |  |  |  |  |  |  |  |  |  |  |  |  |  |  |  |  |  |  |  |  |  |  |  |  |  |  |  |
| Feb-17 | 8.8 |  |  |  |  |  |  |  |  |  |  |  |  |  |  |  |  |  |  |  |  |  |  |  |  |  |  |  |  |  |  |  |  |  |  |  |  |  |  |  |  |  |  |  |  |  |  |  |  |  |  |
| Mar-17 | 8.4 |  |  |  |  |  |  |  |  |  |  |  |  |  |  |  |  |  |  |  |  |  |  |  |  |  |  |  |  |  |  |  |  |  |  |  |  |  |  |  |  |  |  |  |  |  |  |  |  |  |  |
| Apr-17 | 6.3 |  |  |  |  |  |  |  |  |  |  |  |  |  |  |  |  |  |  |  |  |  |  |  |  |  |  |  |  |  |  |  |  |  |  |  |  |  |  |  |  |  |  |  |  |  |  |  |  |  |  |
| May-17 | 5.3 |  |  |  |  |  |  |  |  |  |  |  |  |  |  |  |  |  |  |  |  |  |  |  |  |  |  |  |  |  |  |  |  |  |  |  |  |  |  |  |  |  |  |  |  |  |  |  |  |  |  |
| Jun-17 | 4.5 |  |  |  |  |  |  |  |  |  |  |  |  |  |  |  |  |  |  |  |  |  |  |  |  |  |  |  |  |  |  |  |  |  |  |  |  |  |  |  |  |  |  |  |  |  |  |  |  |  |  |
| Jul-17 | 4.9 |  |  |  |  |  |  |  |  |  |  |  |  |  |  |  |  |  |  |  |  |  |  |  |  |  |  |  |  |  |  |  |  |  |  |  |  |  |  |  |  |  |  |  |  |  |  |  |  |  |  |
| Aug-17 | 4.7 |  |  |  |  |  |  |  |  |  |  |  |  |  |  |  |  |  |  |  |  |  |  |  |  |  |  |  |  |  |  |  |  |  |  |  |  |  |  |  |  |  |  |  |  |  |  |  |  |  |  |
| Sep-17 | 4.7 |  |  |  |  |  |  |  |  |  |  |  |  |  |  |  |  |  |  |  |  |  |  |  |  |  |  |  |  |  |  |  |  |  |  |  |  |  |  |  |  |  |  |  |  |  |  |  |  |  |  |
| Oct-17 | 4.5 |  |  |  |  |  |  |  |  |  |  |  |  |  |  |  |  |  |  |  |  |  |  |  |  |  |  |  |  |  |  |  |  |  |  |  |  |  |  |  |  |  |  |  |  |  |  |  |  |  |  |
| Nov-17 | 5 |  |  |  |  |  |  |  |  |  |  |  |  |  |  |  |  |  |  |  |  |  |  |  |  |  |  |  |  |  |  |  |  |  |  |  |  |  |  |  |  |  |  |  |  |  |  |  |  |  |  |
| Dec-17 | 5.9 |  |  |  |  |  |  |  |  |  |  |  |  |  |  |  |  |  |  |  |  |  |  |  |  |  |  |  |  |  |  |  |  |  |  |  |  |  |  |  |  |  |  |  |  |  |  |  |  |  |  |
| Jan-18 | 7.3 |  |  |  |  |  |  |  |  |  |  |  |  |  |  |  |  |  |  |  |  |  |  |  |  |  |  |  |  |  |  |  |  |  |  |  |  |  |  |  |  |  |  |  |  |  |  |  |  |  |  |
| Feb-18 | 7.8 |  |  |  |  |  |  |  |  |  |  |  |  |  |  |  |  |  |  |  |  |  |  |  |  |  |  |  |  |  |  |  |  |  |  |  |  |  |  |  |  |  |  |  |  |  |  |  |  |  |  |
| Mar-18 | 7.4 |  |  |  |  |  |  |  |  |  |  |  |  |  |  |  |  |  |  |  |  |  |  |  |  |  |  |  |  |  |  |  |  |  |  |  |  |  |  |  |  |  |  |  |  |  |  |  |  |  |  |
| Apr-18 | 6.5 |  |  |  |  |  |  |  |  |  |  |  |  |  |  |  |  |  |  |  |  |  |  |  |  |  |  |  |  |  |  |  |  |  |  |  |  |  |  |  |  |  |  |  |  |  |  |  |  |  |  |
| May-18 | 4.4 |  |  |  |  |  |  |  |  |  |  |  |  |  |  |  |  |  |  |  |  |  |  |  |  |  |  |  |  |  |  |  |  |  |  |  |  |  |  |  |  |  |  |  |  |  |  |  |  |  |  |
| Jun-18 | 4.7 |  |  |  |  |  |  |  |  |  |  |  |  |  |  |  |  |  |  |  |  |  |  |  |  |  |  |  |  |  |  |  |  |  |  |  |  |  |  |  |  |  |  |  |  |  |  |  |  |  |  |
| Jul-18 | 3.4 |  |  |  |  |  |  |  |  |  |  |  |  |  |  |  |  |  |  |  |  |  |  |  |  |  |  |  |  |  |  |  |  |  |  |  |  |  |  |  |  |  |  |  |  |  |  |  |  |  |  |
| Aug-18 | 3.4 |  |  |  |  |  |  |  |  |  |  |  |  |  |  |  |  |  |  |  |  |  |  |  |  |  |  |  |  |  |  |  |  |  |  |  |  |  |  |  |  |  |  |  |  |  |  |  |  |  |  |
| Sep-18 | 4.1 |  |  |  |  |  |  |  |  |  |  |  |  |  |  |  |  |  |  |  |  |  |  |  |  |  |  |  |  |  |  |  |  |  |  |  |  |  |  |  |  |  |  |  |  |  |  |  |  |  |  |
| Oct-18 | 3.6 |  |  |  |  |  |  |  |  |  |  |  |  |  |  |  |  |  |  |  |  |  |  |  |  |  |  |  |  |  |  |  |  |  |  |  |  |  |  |  |  |  |  |  |  |  |  |  |  |  |  |
| Nov-18 | 3.9 |  |  |  |  |  |  |  |  |  |  |  |  |  |  |  |  |  |  |  |  |  |  |  |  |  |  |  |  |  |  |  |  |  |  |  |  |  |  |  |  |  |  |  |  |  |  |  |  |  |  |
| Dec-18 | 5.1 |  |  |  |  |  |  |  |  |  |  |  |  |  |  |  |  |  |  |  |  |  |  |  |  |  |  |  |  |  |  |  |  |  |  |  |  |  |  |  |  |  |  |  |  |  |  |  |  |  |  |
| Jan-19 | 6.4 |  |  |  |  |  |  |  |  |  |  |  |  |  |  |  |  |  |  |  |  |  |  |  |  |  |  |  |  |  |  |  |  |  |  |  |  |  |  |  |  |  |  |  |  |  |  |  |  |  |  |
| Feb-19 | 6.2 |  |  |  |  |  |  |  |  |  |  |  |  |  |  |  |  |  |  |  |  |  |  |  |  |  |  |  |  |  |  |  |  |  |  |  |  |  |  |  |  |  |  |  |  |  |  |  |  |  |  |
| Mar-19 | 5.2 |  |  |  |  |  |  |  |  |  |  |  |  |  |  |  |  |  |  |  |  |  |  |  |  |  |  |  |  |  |  |  |  |  |  |  |  |  |  |  |  |  |  |  |  |  |  |  |  |  |  |
| Apr-19 | 4.7 |  |  |  |  |  |  |  |  |  |  |  |  |  |  |  |  |  |  |  |  |  |  |  |  |  |  |  |  |  |  |  |  |  |  |  |  |  |  |  |  |  |  |  |  |  |  |  |  |  |  |
| May-19 | 3.2 |  |  |  |  |  |  |  |  |  |  |  |  |  |  |  |  |  |  |  |  |  |  |  |  |  |  |  |  |  |  |  |  |  |  |  |  |  |  |  |  |  |  |  |  |  |  |  |  |  |  |
| Jun-19 | 4 |  |  |  |  |  |  |  |  |  |  |  |  |  |  |  |  |  |  |  |  |  |  |  |  |  |  |  |  |  |  |  |  |  |  |  |  |  |  |  |  |  |  |  |  |  |  |  |  |  |  |
| Jul-19 | 3.8 |  |  |  |  |  |  |  |  |  |  |  |  |  |  |  |  |  |  |  |  |  |  |  |  |  |  |  |  |  |  |  |  |  |  |  |  |  |  |  |  |  |  |  |  |  |  |  |  |  |  |
| Aug-19 | 3.6 |  |  |  |  |  |  |  |  |  |  |  |  |  |  |  |  |  |  |  |  |  |  |  |  |  |  |  |  |  |  |  |  |  |  |  |  |  |  |  |  |  |  |  |  |  |  |  |  |  |  |
| Sep-19 | 3.2 |  |  |  |  |  |  |  |  |  |  |  |  |  |  |  |  |  |  |  |  |  |  |  |  |  |  |  |  |  |  |  |  |  |  |  |  |  |  |  |  |  |  |  |  |  |  |  |  |  |  |
| Oct-19 | 4 |  |  |  |  |  |  |  |  |  |  |  |  |  |  |  |  |  |  |  |  |  |  |  |  |  |  |  |  |  |  |  |  |  |  |  |  |  |  |  |  |  |  |  |  |  |  |  |  |  |  |
| Nov-19 | 4.4 |  |  |  |  |  |  |  |  |  |  |  |  |  |  |  |  |  |  |  |  |  |  |  |  |  |  |  |  |  |  |  |  |  |  |  |  |  |  |  |  |  |  |  |  |  |  |  |  |  |  |
| Dec-19 | 5 |  |  |  |  |  |  |  |  |  |  |  |  |  |  |  |  |  |  |  |  |  |  |  |  |  |  |  |  |  |  |  |  |  |  |  |  |  |  |  |  |  |  |  |  |  |  |  |  |  |  |
| Jan-20 | 5.4 |  |  |  |  |  |  |  |  |  |  |  |  |  |  |  |  |  |  |  |  |  |  |  |  |  |  |  |  |  |  |  |  |  |  |  |  |  |  |  |  |  |  |  |  |  |  |  |  |  |  |
| Feb-20 | 5.5 |  |  |  |  |  |  |  |  |  |  |  |  |  |  |  |  |  |  |  |  |  |  |  |  |  |  |  |  |  |  |  |  |  |  |  |  |  |  |  |  |  |  |  |  |  |  |  |  |  |  |
| Mar-20 | 6.9 |  |  |  |  |  |  |  |  |  |  |  |  |  |  |  |  |  |  |  |  |  |  |  |  |  |  |  |  |  |  |  |  |  |  |  |  |  |  |  |  |  |  |  |  |  |  |  |  |  |  |
| Apr-20 | 16.6 |  |  |  |  |  |  |  |  |  |  |  |  |  |  |  |  |  |  |  |  |  |  |  |  |  |  |  |  |  |  |  |  |  |  |  |  |  |  |  |  |  |  |  |  |  |  |  |  |  |  |
| May-20 | 12.7 |  |  |  |  |  |  |  |  |  |  |  |  |  |  |  |  |  |  |  |  |  |  |  |  |  |  |  |  |  |  |  |  |  |  |  |  |  |  |  |  |  |  |  |  |  |  |  |  |  |  |
| Jun-20 | 10.1 |  |  |  |  |  |  |  |  |  |  |  |  |  |  |  |  |  |  |  |  |  |  |  |  |  |  |  |  |  |  |  |  |  |  |  |  |  |  |  |  |  |  |  |  |  |  |  |  |  |  |
| Jul-20 | 8.9 |  |  |  |  |  |  |  |  |  |  |  |  |  |  |  |  |  |  |  |  |  |  |  |  |  |  |  |  |  |  |  |  |  |  |  |  |  |  |  |  |  |  |  |  |  |  |  |  |  |  |
| Aug-20 | 7.6 |  |  |  |  |  |  |  |  |  |  |  |  |  |  |  |  |  |  |  |  |  |  |  |  |  |  |  |  |  |  |  |  |  |  |  |  |  |  |  |  |  |  |  |  |  |  |  |  |  |  |
| Sep-20 | 7.1 |  |  |  |  |  |  |  |  |  |  |  |  |  |  |  |  |  |  |  |  |  |  |  |  |  |  |  |  |  |  |  |  |  |  |  |  |  |  |  |  |  |  |  |  |  |  |  |  |  |  |
| Oct-20 | 6.8 |  |  |  |  |  |  |  |  |  |  |  |  |  |  |  |  |  |  |  |  |  |  |  |  |  |  |  |  |  |  |  |  |  |  |  |  |  |  |  |  |  |  |  |  |  |  |  |  |  |  |
| Nov-20 | 7.3 |  |  |  |  |  |  |  |  |  |  |  |  |  |  |  |  |  |  |  |  |  |  |  |  |  |  |  |  |  |  |  |  |  |  |  |  |  |  |  |  |  |  |  |  |  |  |  |  |  |  |
| Dec-20 | 9.6 |  |  |  |  |  |  |  |  |  |  |  |  |  |  |  |  |  |  |  |  |  |  |  |  |  |  |  |  |  |  |  |  |  |  |  |  |  |  |  |  |  |  |  |  |  |  |  |  |  |  |
| Jan-21 | 9.4 |  |  |  |  |  |  |  |  |  |  |  |  |  |  |  |  |  |  |  |  |  |  |  |  |  |  |  |  |  |  |  |  |  |  |  |  |  |  |  |  |  |  |  |  |  |  |  |  |  |  |
| Feb-21 | 9.6 |  |  |  |  |  |  |  |  |  |  |  |  |  |  |  |  |  |  |  |  |  |  |  |  |  |  |  |  |  |  |  |  |  |  |  |  |  |  |  |  |  |  |  |  |  |  |  |  |  |  |
| Mar-21 | 8.6 |  |  |  |  |  |  |  |  |  |  |  |  |  |  |  |  |  |  |  |  |  |  |  |  |  |  |  |  |  |  |  |  |  |  |  |  |  |  |  |  |  |  |  |  |  |  |  |  |  |  |
| Apr-21 | 7.7 |  |  |  |  |  |  |  |  |  |  |  |  |  |  |  |  |  |  |  |  |  |  |  |  |  |  |  |  |  |  |  |  |  |  |  |  |  |  |  |  |  |  |  |  |  |  |  |  |  |  |
| May-21 | 6.7 |  |  |  |  |  |  |  |  |  |  |  |  |  |  |  |  |  |  |  |  |  |  |  |  |  |  |  |  |  |  |  |  |  |  |  |  |  |  |  |  |  |  |  |  |  |  |  |  |  |  |
| Jun-21 | 7.5 |  |  |  |  |  |  |  |  |  |  |  |  |  |  |  |  |  |  |  |  |  |  |  |  |  |  |  |  |  |  |  |  |  |  |  |  |  |  |  |  |  |  |  |  |  |  |  |  |  |  |
| Jul-21 | 6.1 |  |  |  |  |  |  |  |  |  |  |  |  |  |  |  |  |  |  |  |  |  |  |  |  |  |  |  |  |  |  |  |  |  |  |  |  |  |  |  |  |  |  |  |  |  |  |  |  |  |  |
| Aug-21 | 4.6 |  |  |  |  |  |  |  |  |  |  |  |  |  |  |  |  |  |  |  |  |  |  |  |  |  |  |  |  |  |  |  |  |  |  |  |  |  |  |  |  |  |  |  |  |  |  |  |  |  |  |
| Sep-21 | 4.5 |  |  |  |  |  |  |  |  |  |  |  |  |  |  |  |  |  |  |  |  |  |  |  |  |  |  |  |  |  |  |  |  |  |  |  |  |  |  |  |  |  |  |  |  |  |  |  |  |  |  |
| Oct-21 | 4 |  |  |  |  |  |  |  |  |  |  |  |  |  |  |  |  |  |  |  |  |  |  |  |  |  |  |  |  |  |  |  |  |  |  |  |  |  |  |  |  |  |  |  |  |  |  |  |  |  |  |
| Nov-21 | 4.7 |  |  |  |  |  |  |  |  |  |  |  |  |  |  |  |  |  |  |  |  |  |  |  |  |  |  |  |  |  |  |  |  |  |  |  |  |  |  |  |  |  |  |  |  |  |  |  |  |  |  |
| Dec-21 | 5 |  |  |  |  |  |  |  |  |  |  |  |  |  |  |  |  |  |  |  |  |  |  |  |  |  |  |  |  |  |  |  |  |  |  |  |  |  |  |  |  |  |  |  |  |  |  |  |  |  |  |
| Jan-22 | 7.1 |  |  |  |  |  |  |  |  |  |  |  |  |  |  |  |  |  |  |  |  |  |  |  |  |  |  |  |  |  |  |  |  |  |  |  |  |  |  |  |  |  |  |  |  |  |  |  |  |  |  |
| Feb-22 | 6.7 |  |  |  |  |  |  |  |  |  |  |  |  |  |  |  |  |  |  |  |  |  |  |  |  |  |  |  |  |  |  |  |  |  |  |  |  |  |  |  |  |  |  |  |  |  |  |  |  |  |  |
| Mar-22 | 6 |  |  |  |  |  |  |  |  |  |  |  |  |  |  |  |  |  |  |  |  |  |  |  |  |  |  |  |  |  |  |  |  |  |  |  |  |  |  |  |  |  |  |  |  |  |  |  |  |  |  |
| Apr-22 | 4.6 |  |  |  |  |  |  |  |  |  |  |  |  |  |  |  |  |  |  |  |  |  |  |  |  |  |  |  |  |  |  |  |  |  |  |  |  |  |  |  |  |  |  |  |  |  |  |  |  |  |  |
| May-22 | 3.8 |  |  |  |  |  |  |  |  |  |  |  |  |  |  |  |  |  |  |  |  |  |  |  |  |  |  |  |  |  |  |  |  |  |  |  |  |  |  |  |  |  |  |  |  |  |  |  |  |  |  |
| Jun-22 | 3.7 |  |  |  |  |  |  |  |  |  |  |  |  |  |  |  |  |  |  |  |  |  |  |  |  |  |  |  |  |  |  |  |  |  |  |  |  |  |  |  |  |  |  |  |  |  |  |  |  |  |  |
| Jul-22 | 3.5 |  |  |  |  |  |  |  |  |  |  |  |  |  |  |  |  |  |  |  |  |  |  |  |  |  |  |  |  |  |  |  |  |  |  |  |  |  |  |  |  |  |  |  |  |  |  |  |  |  |  |
| Aug-22 | 3.9 |  |  |  |  |  |  |  |  |  |  |  |  |  |  |  |  |  |  |  |  |  |  |  |  |  |  |  |  |  |  |  |  |  |  |  |  |  |  |  |  |  |  |  |  |  |  |  |  |  |  |
| Sep-22 | 3.4 |  |  |  |  |  |  |  |  |  |  |  |  |  |  |  |  |  |  |  |  |  |  |  |  |  |  |  |  |  |  |  |  |  |  |  |  |  |  |  |  |  |  |  |  |  |  |  |  |  |  |